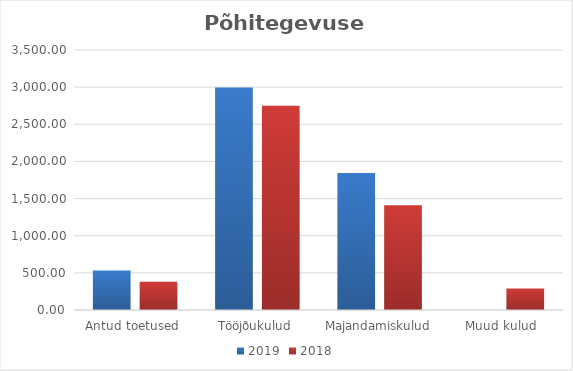
| Category | 2019 | 2018 |
|---|---|---|
| Antud toetused  | 532.953 | 381.734 |
| Tööjõukulud | 2995.469 | 2748.2 |
| Majandamiskulud | 1842.649 | 1410.541 |
| Muud kulud | 0.558 | 289.607 |